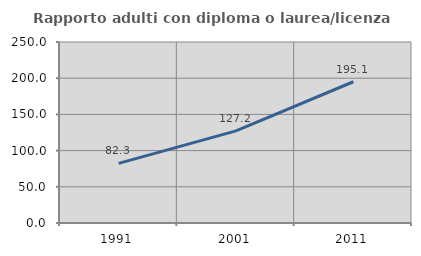
| Category | Rapporto adulti con diploma o laurea/licenza media  |
|---|---|
| 1991.0 | 82.313 |
| 2001.0 | 127.228 |
| 2011.0 | 195.092 |